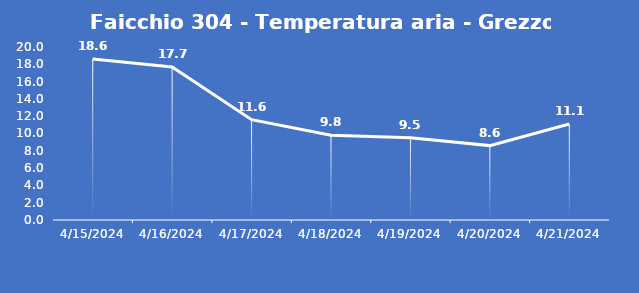
| Category | Faicchio 304 - Temperatura aria - Grezzo (°C) |
|---|---|
| 4/15/24 | 18.6 |
| 4/16/24 | 17.7 |
| 4/17/24 | 11.6 |
| 4/18/24 | 9.8 |
| 4/19/24 | 9.5 |
| 4/20/24 | 8.6 |
| 4/21/24 | 11.1 |